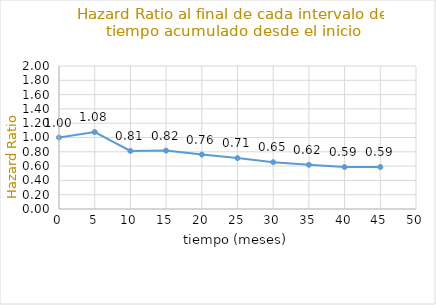
| Category | HRi |
|---|---|
| 0.0 | 1 |
| 5.0 | 1.076 |
| 10.0 | 0.812 |
| 15.0 | 0.817 |
| 20.0 | 0.762 |
| 25.0 | 0.712 |
| 30.0 | 0.655 |
| 35.0 | 0.618 |
| 40.0 | 0.587 |
| 45.0 | 0.587 |